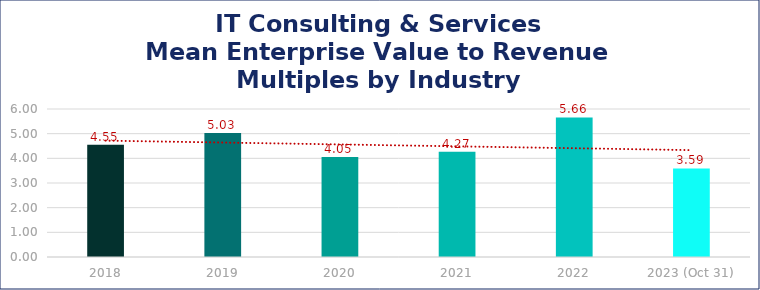
| Category | IT Consulting & Services |
|---|---|
| 2018 | 4.55 |
| 2019 | 5.03 |
| 2020 | 4.05 |
| 2021 | 4.27 |
| 2022 | 5.66 |
| 2023 (Oct 31) | 3.59 |